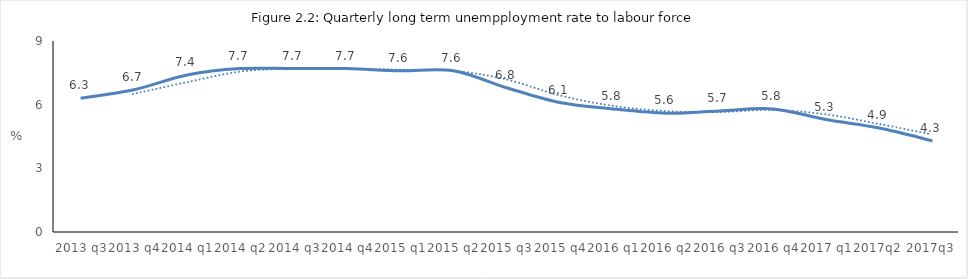
| Category |  >12 μήνες/εργατικό δυναμικό  |
|---|---|
| 2013 q3 | 6.3 |
| 2013 q4 | 6.7 |
| 2014 q1 | 7.4 |
| 2014 q2 | 7.7 |
| 2014 q3 | 7.7 |
| 2014 q4 | 7.7 |
| 2015 q1 | 7.6 |
| 2015 q2 | 7.6 |
| 2015 q3 | 6.8 |
| 2015 q4 | 6.1 |
| 2016 q1 | 5.8 |
| 2016 q2 | 5.6 |
| 2016 q3 | 5.7 |
| 2016 q4 | 5.8 |
| 2017 q1 | 5.3 |
| 2017q2 | 4.9 |
| 2017q3 | 4.3 |